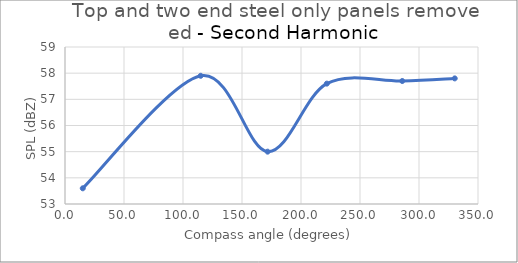
| Category | Series 0 |
|---|---|
| 15.06445125542554 | 53.6 |
| 115.00449447818254 | 57.9 |
| 171.7068171198818 | 55 |
| 221.8691292075067 | 57.6 |
| 285.7828166838848 | 57.7 |
| 330.28010595813004 | 57.8 |